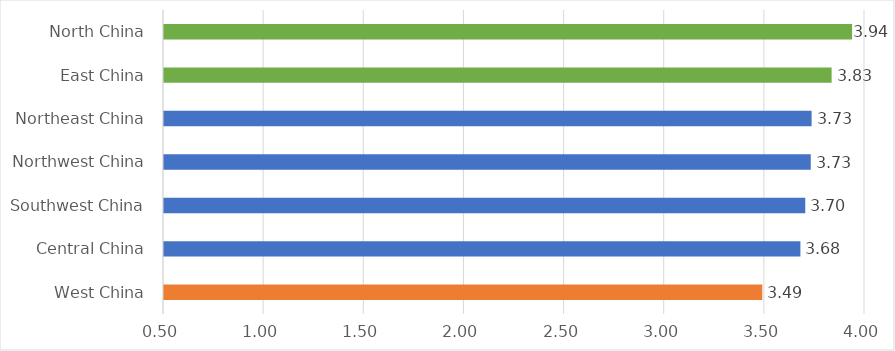
| Category | Series 0 |
|---|---|
| West China | 3.487 |
| Central China | 3.677 |
| Southwest China | 3.702 |
| Northwest China | 3.729 |
| Northeast China | 3.733 |
| East China | 3.833 |
| North China | 3.935 |